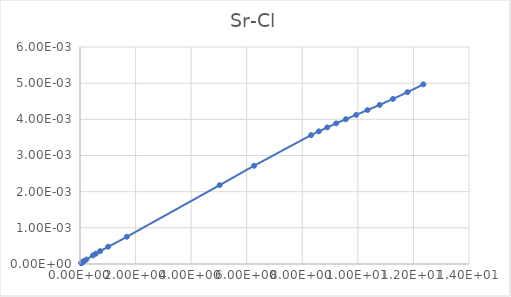
| Category | Series 0 |
|---|---|
| 0.045799 | 0 |
| 0.050887 | 0 |
| 0.057261 | 0 |
| 0.065458 | 0 |
| 0.076373 | 0 |
| 0.091688 | 0 |
| 0.11464 | 0 |
| 0.15299 | 0 |
| 0.22973 | 0 |
| 0.46172 | 0 |
| 0.56419 | 0 |
| 0.72511 | 0 |
| 1.0144 | 0 |
| 1.688 | 0.001 |
| 5.0263 | 0.002 |
| 6.2654 | 0.003 |
| 8.3152 | 0.004 |
| 8.5965 | 0.004 |
| 8.8974 | 0.004 |
| 9.2202 | 0.004 |
| 9.5673 | 0.004 |
| 9.9415 | 0.004 |
| 10.346 | 0.004 |
| 10.785 | 0.004 |
| 11.263 | 0.005 |
| 11.785 | 0.005 |
| 12.358 | 0.005 |